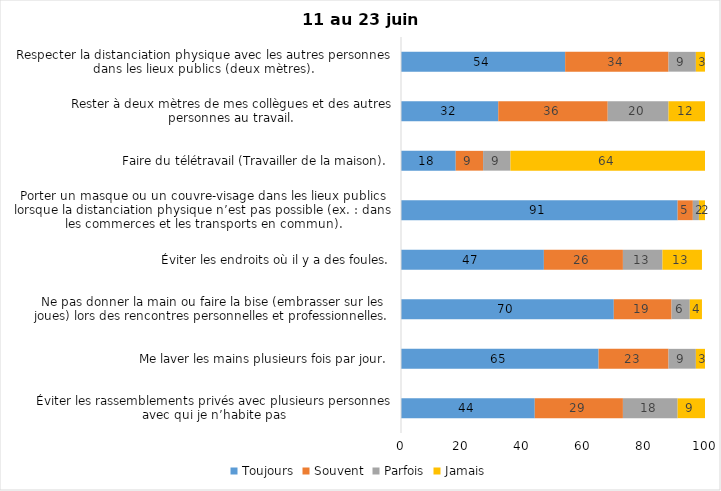
| Category | Toujours | Souvent | Parfois | Jamais |
|---|---|---|---|---|
| Éviter les rassemblements privés avec plusieurs personnes avec qui je n’habite pas | 44 | 29 | 18 | 9 |
| Me laver les mains plusieurs fois par jour. | 65 | 23 | 9 | 3 |
| Ne pas donner la main ou faire la bise (embrasser sur les joues) lors des rencontres personnelles et professionnelles. | 70 | 19 | 6 | 4 |
| Éviter les endroits où il y a des foules. | 47 | 26 | 13 | 13 |
| Porter un masque ou un couvre-visage dans les lieux publics lorsque la distanciation physique n’est pas possible (ex. : dans les commerces et les transports en commun). | 91 | 5 | 2 | 2 |
| Faire du télétravail (Travailler de la maison). | 18 | 9 | 9 | 64 |
| Rester à deux mètres de mes collègues et des autres personnes au travail. | 32 | 36 | 20 | 12 |
| Respecter la distanciation physique avec les autres personnes dans les lieux publics (deux mètres). | 54 | 34 | 9 | 3 |